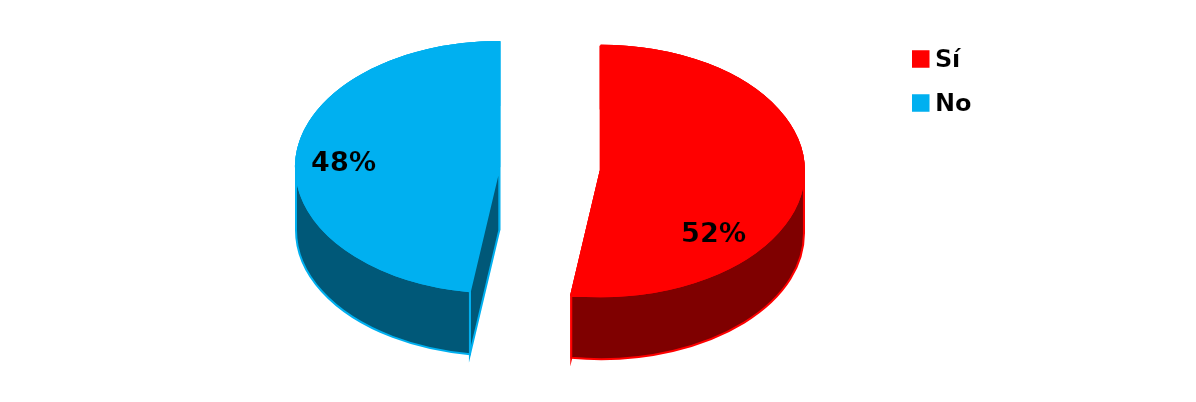
| Category | Series 0 |
|---|---|
| Sí | 68 |
| No | 62 |